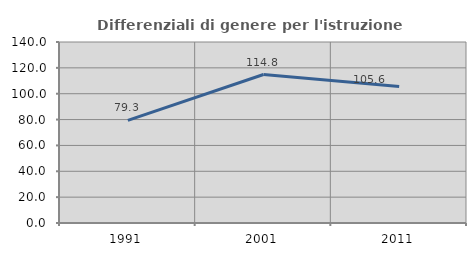
| Category | Differenziali di genere per l'istruzione superiore |
|---|---|
| 1991.0 | 79.326 |
| 2001.0 | 114.833 |
| 2011.0 | 105.568 |